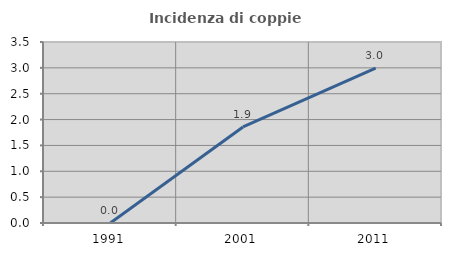
| Category | Incidenza di coppie miste |
|---|---|
| 1991.0 | 0 |
| 2001.0 | 1.858 |
| 2011.0 | 2.996 |